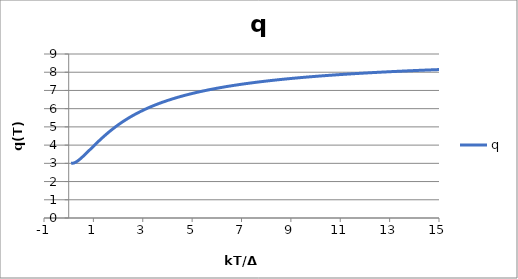
| Category | q |
|---|---|
| 0.1 | 3 |
| 0.2 | 3.013 |
| 0.3 | 3.072 |
| 0.4 | 3.166 |
| 0.5 | 3.281 |
| 0.6 | 3.405 |
| 0.7 | 3.534 |
| 0.8 | 3.667 |
| 0.9 | 3.801 |
| 1.0 | 3.935 |
| 1.1 | 4.067 |
| 1.2 | 4.198 |
| 1.3 | 4.325 |
| 1.4 | 4.448 |
| 1.5 | 4.568 |
| 1.6 | 4.684 |
| 1.7 | 4.796 |
| 1.8 | 4.903 |
| 1.9 | 5.006 |
| 2.0 | 5.106 |
| 2.1 | 5.201 |
| 2.2 | 5.292 |
| 2.3 | 5.38 |
| 2.4 | 5.465 |
| 2.5 | 5.545 |
| 2.6 | 5.623 |
| 2.7 | 5.698 |
| 2.8 | 5.769 |
| 2.9 | 5.838 |
| 3.0 | 5.905 |
| 3.1 | 5.968 |
| 3.2 | 6.03 |
| 3.3 | 6.089 |
| 3.4 | 6.146 |
| 3.5 | 6.2 |
| 3.6 | 6.253 |
| 3.7 | 6.304 |
| 3.8 | 6.354 |
| 3.9 | 6.401 |
| 4.0 | 6.447 |
| 4.1 | 6.491 |
| 4.2 | 6.534 |
| 4.3 | 6.576 |
| 4.4 | 6.616 |
| 4.5 | 6.655 |
| 4.6 | 6.693 |
| 4.7 | 6.729 |
| 4.8 | 6.765 |
| 4.9 | 6.799 |
| 5.0 | 6.833 |
| 5.1 | 6.865 |
| 5.2 | 6.897 |
| 5.3 | 6.927 |
| 5.4 | 6.957 |
| 5.5 | 6.986 |
| 5.6 | 7.014 |
| 5.7 | 7.041 |
| 5.8 | 7.068 |
| 5.9 | 7.094 |
| 6.0 | 7.119 |
| 6.1 | 7.144 |
| 6.2 | 7.168 |
| 6.3 | 7.191 |
| 6.4 | 7.214 |
| 6.5 | 7.236 |
| 6.6 | 7.258 |
| 6.7 | 7.279 |
| 6.8 | 7.3 |
| 6.9 | 7.32 |
| 7.0 | 7.34 |
| 7.1 | 7.359 |
| 7.2 | 7.378 |
| 7.3 | 7.396 |
| 7.4 | 7.414 |
| 7.5 | 7.432 |
| 7.6 | 7.449 |
| 7.7 | 7.466 |
| 7.8 | 7.482 |
| 7.9 | 7.498 |
| 8.0 | 7.514 |
| 8.1 | 7.53 |
| 8.2 | 7.545 |
| 8.3 | 7.56 |
| 8.4 | 7.574 |
| 8.5 | 7.588 |
| 8.6 | 7.602 |
| 8.7 | 7.616 |
| 8.8 | 7.63 |
| 8.9 | 7.643 |
| 9.0 | 7.656 |
| 9.1 | 7.669 |
| 9.2 | 7.681 |
| 9.3 | 7.693 |
| 9.4 | 7.705 |
| 9.5 | 7.717 |
| 9.6 | 7.729 |
| 9.7 | 7.74 |
| 9.8 | 7.751 |
| 9.9 | 7.762 |
| 10.0 | 7.773 |
| 10.1 | 7.784 |
| 10.2 | 7.794 |
| 10.3 | 7.804 |
| 10.4 | 7.814 |
| 10.5 | 7.824 |
| 10.6 | 7.834 |
| 10.7 | 7.844 |
| 10.8 | 7.853 |
| 10.9 | 7.862 |
| 11.0 | 7.871 |
| 11.1 | 7.88 |
| 11.2 | 7.889 |
| 11.3 | 7.898 |
| 11.4 | 7.907 |
| 11.5 | 7.915 |
| 11.6 | 7.923 |
| 11.7 | 7.931 |
| 11.8 | 7.94 |
| 11.9 | 7.947 |
| 12.0 | 7.955 |
| 12.1 | 7.963 |
| 12.2 | 7.971 |
| 12.3 | 7.978 |
| 12.4 | 7.985 |
| 12.5 | 7.993 |
| 12.6 | 8 |
| 12.7 | 8.007 |
| 12.8 | 8.014 |
| 12.9 | 8.021 |
| 13.0 | 8.028 |
| 13.1 | 8.034 |
| 13.2 | 8.041 |
| 13.3 | 8.047 |
| 13.4 | 8.054 |
| 13.5 | 8.06 |
| 13.6 | 8.066 |
| 13.7 | 8.073 |
| 13.8 | 8.079 |
| 13.9 | 8.085 |
| 14.0 | 8.091 |
| 14.1 | 8.096 |
| 14.2 | 8.102 |
| 14.3 | 8.108 |
| 14.4 | 8.114 |
| 14.5 | 8.119 |
| 14.6 | 8.125 |
| 14.7 | 8.13 |
| 14.8 | 8.135 |
| 14.9 | 8.141 |
| 15.0 | 8.146 |